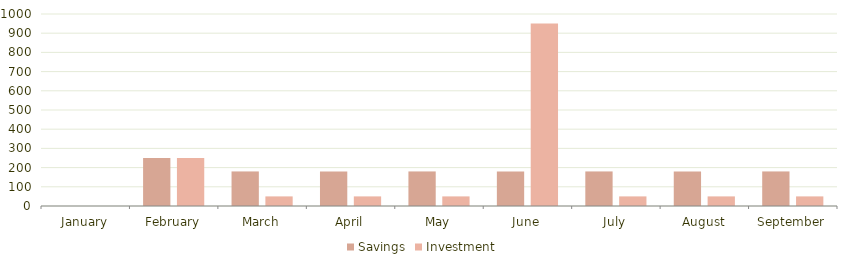
| Category | Savings | Investment |
|---|---|---|
| January | 0 | 0 |
| February | 250 | 250 |
| March | 180 | 50 |
| April | 180 | 50 |
| May | 180 | 50 |
| June | 180 | 950 |
| July | 180 | 50 |
| August | 180 | 50 |
| September | 180 | 50 |